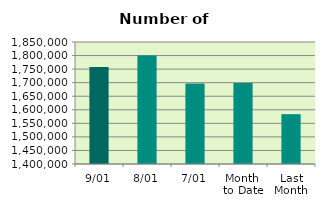
| Category | Series 0 |
|---|---|
| 9/01 | 1758168 |
| 8/01 | 1800132 |
| 7/01 | 1696608 |
| Month 
to Date | 1698491 |
| Last
Month | 1583843.3 |